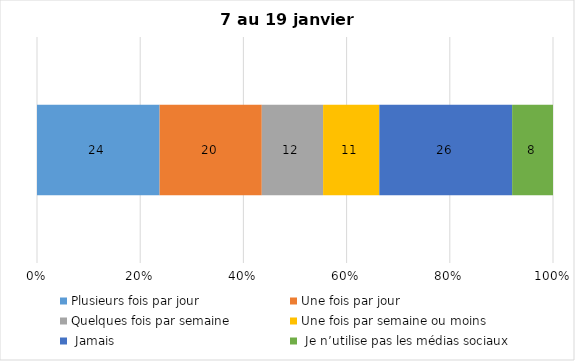
| Category | Plusieurs fois par jour | Une fois par jour | Quelques fois par semaine   | Une fois par semaine ou moins   |  Jamais   |  Je n’utilise pas les médias sociaux |
|---|---|---|---|---|---|---|
| 0 | 24 | 20 | 12 | 11 | 26 | 8 |